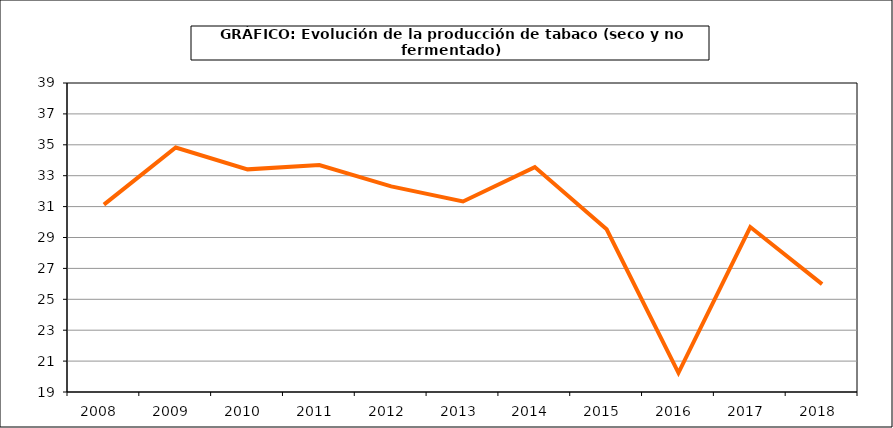
| Category | Producción |
|---|---|
| 2008.0 | 31.127 |
| 2009.0 | 34.827 |
| 2010.0 | 33.41 |
| 2011.0 | 33.692 |
| 2012.0 | 32.308 |
| 2013.0 | 31.333 |
| 2014.0 | 33.557 |
| 2015.0 | 29.534 |
| 2016.0 | 20.238 |
| 2017.0 | 29.679 |
| 2018.0 | 25.983 |